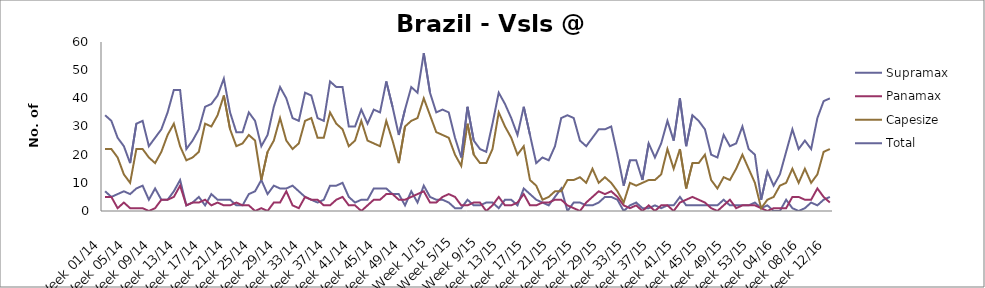
| Category | Supramax | Panamax | Capesize | Total |
|---|---|---|---|---|
| Week 01/14 | 7 | 5 | 22 | 34 |
| Week 02/14 | 5 | 5 | 22 | 32 |
| Week 03/14 | 6 | 1 | 19 | 26 |
| Week 04/14 | 7 | 3 | 13 | 23 |
| Week 05/14 | 6 | 1 | 10 | 17 |
| Week 06/14 | 8 | 1 | 22 | 31 |
| Week 07/14 | 9 | 1 | 22 | 32 |
| Week 08/14 | 4 | 0 | 19 | 23 |
| Week 09/14 | 8 | 1 | 17 | 26 |
| Week 10/14 | 4 | 4 | 21 | 29 |
| Week 11/14 | 4 | 4 | 27 | 35 |
| Week 12/14 | 7 | 5 | 31 | 43 |
| Week 13/14 | 11 | 9 | 23 | 43 |
| Week 14/14 | 2 | 2 | 18 | 22 |
| Week 15/14 | 3 | 3 | 19 | 25 |
| Week 16/14 | 5 | 3 | 21 | 29 |
| Week 17/14 | 2 | 4 | 31 | 37 |
| Week 18/14 | 6 | 2 | 30 | 38 |
| Week 19/14 | 4 | 3 | 34 | 41 |
| Week 20/14 | 4 | 2 | 41 | 47 |
| Week 21/14 | 4 | 2 | 29 | 35 |
| Week 22/14 | 2 | 3 | 23 | 28 |
| Week 23/14 | 2 | 2 | 24 | 28 |
| Week 24/14 | 6 | 2 | 27 | 35 |
| Week 25/14 | 7 | 0 | 25 | 32 |
| Week 26/14 | 11 | 1 | 11 | 23 |
| Week 27/14 | 6 | 0 | 21 | 27 |
| Week 28/14 | 9 | 3 | 25 | 37 |
| Week 29/14 | 8 | 3 | 33 | 44 |
| Week 30/14 | 8 | 7 | 25 | 40 |
| Week 31/14 | 9 | 2 | 22 | 33 |
| Week 32/14 | 7 | 1 | 24 | 32 |
| Week 33/14 | 5 | 5 | 32 | 42 |
| Week 34/14 | 4 | 4 | 33 | 41 |
| Week 35/14 | 3 | 4 | 26 | 33 |
| Week 36/14 | 4 | 2 | 26 | 32 |
| Week 37/14 | 9 | 2 | 35 | 46 |
| Week 38/14 | 9 | 4 | 31 | 44 |
| Week 39/14 | 10 | 5 | 29 | 44 |
| Week 40/14 | 5 | 2 | 23 | 30 |
| Week 41/14 | 3 | 2 | 25 | 30 |
| Week 42/14 | 4 | 0 | 32 | 36 |
| Week 43/14 | 4 | 2 | 25 | 31 |
| Week 44/14 | 8 | 4 | 24 | 36 |
| Week 45/14 | 8 | 4 | 23 | 35 |
| Week 46/14 | 8 | 6 | 32 | 46 |
| Week 47/14 | 6 | 6 | 25 | 37 |
| Week 48/14 | 6 | 4 | 17 | 27 |
| Week 49/14 | 2 | 4 | 30 | 36 |
| Week 50/14 | 7 | 5 | 32 | 44 |
| Week 51/14 | 3 | 6 | 33 | 42 |
| Week 52/14 | 9 | 7 | 40 | 56 |
| Week 1/15 | 5 | 3 | 34 | 42 |
| Week 2/15 | 4 | 3 | 28 | 35 |
| Week 3/15 | 4 | 5 | 27 | 36 |
| Week 4/15 | 3 | 6 | 26 | 35 |
| Week 5/15 | 1 | 5 | 20 | 26 |
| Week 6/15 | 1 | 2 | 16 | 19 |
| Week 7/15 | 4 | 2 | 31 | 37 |
| Week 8/15 | 2 | 3 | 20 | 25 |
| Week 9/15 | 2 | 3 | 17 | 22 |
| Week 10/15 | 3 | 0 | 17 | 21 |
| Week 11/15 | 3 | 2 | 22 | 31 |
| Week 12/15 | 1 | 5 | 35 | 42 |
| Week 13/15 | 4 | 2 | 30 | 38 |
| Week 14/15 | 4 | 2 | 26 | 33 |
| Week 15/15 | 2 | 3 | 20 | 27 |
| Week 16/15 | 8 | 6 | 23 | 37 |
| Week 17/15 | 6 | 2 | 11 | 27 |
| Week 18/15 | 4 | 2 | 9 | 17 |
| Week 19/15 | 3 | 3 | 4 | 19 |
| Week 20/15 | 2 | 3 | 5 | 18 |
| Week 21/15 | 5 | 4 | 7 | 23 |
| Week 22/15 | 8 | 4 | 7 | 33 |
| Week 23/15 | 0 | 2 | 11 | 34 |
| Week 24/15 | 3 | 1 | 11 | 33 |
| Week 25/15 | 3 | 0 | 12 | 25 |
| Week 26/15 | 2 | 3 | 10 | 23 |
| Week 27/15 | 2 | 5 | 15 | 26 |
| Week 28/15 | 3 | 7 | 10 | 29 |
| Week 29/15 | 5 | 6 | 12 | 29 |
| Week 30/15 | 5 | 7 | 10 | 30 |
| Week 31/15 | 4 | 5 | 7 | 20 |
| Week 32/15 | 0 | 2 | 3 | 9 |
| Week 33/15 | 2 | 1 | 10 | 18 |
| Week 34/15 | 3 | 2 | 9 | 18 |
| Week 35/15 | 1 | 0 | 10 | 11 |
| Week 36/15 | 1 | 2 | 11 | 24 |
| Week 37/15 | 2 | 0 | 11 | 19 |
| Week 38/15 | 1 | 2 | 13 | 24 |
| Week 39/15 | 2 | 2 | 22 | 32 |
| Week 40/15 | 2 | 0 | 15 | 25 |
| Week 41/15 | 5 | 3 | 22 | 40 |
| Week 42/15 | 2 | 4 | 8 | 23 |
| Week 43/15 | 2 | 5 | 17 | 34 |
| Week 44/15 | 2 | 4 | 17 | 32 |
| Week 45/15 | 2 | 3 | 20 | 29 |
| Week 46/15 | 2 | 1 | 11 | 20 |
| Week 47/15 | 2 | 0 | 8 | 19 |
| Week 48/15 | 4 | 2 | 12 | 27 |
| Week 49/15 | 2 | 4 | 11 | 23 |
| Week 50/15 | 2 | 1 | 15 | 24 |
| Week 51/15 | 2 | 2 | 20 | 30 |
| Week 52/15 | 2 | 2 | 15 | 22 |
| Week 53/15 | 3 | 2 | 10 | 20 |
| Week 01/16 | 1 | 1 | 1 | 4 |
| Week 02/16 | 2 | 0 | 4 | 14 |
| Week 03/16 | 0 | 1 | 5 | 9 |
| Week 04/16 | 0 | 1 | 9 | 13 |
| Week 05/16 | 4 | 1 | 10 | 21 |
| Week 06/16 | 1 | 5 | 15 | 29 |
| Week 07/16 | 0 | 5 | 10 | 22 |
| Week 08/16 | 1 | 4 | 15 | 25 |
| Week 09/16 | 3 | 4 | 10 | 22 |
| Week 10/16 | 2 | 8 | 13 | 33 |
| Week 11/16 | 4 | 5 | 21 | 39 |
| Week 12/16 | 5 | 3 | 22 | 40 |